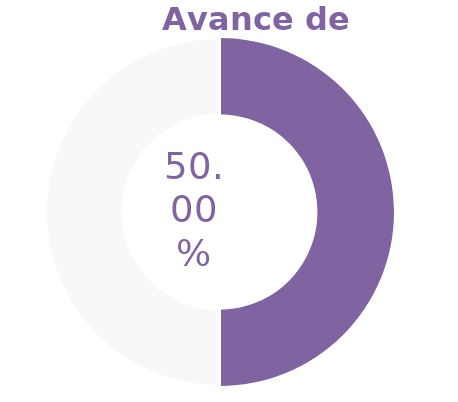
| Category | Series 0 |
|---|---|
| Acumulado 1 Trimestre | 0.5 |
| Año | -0.5 |